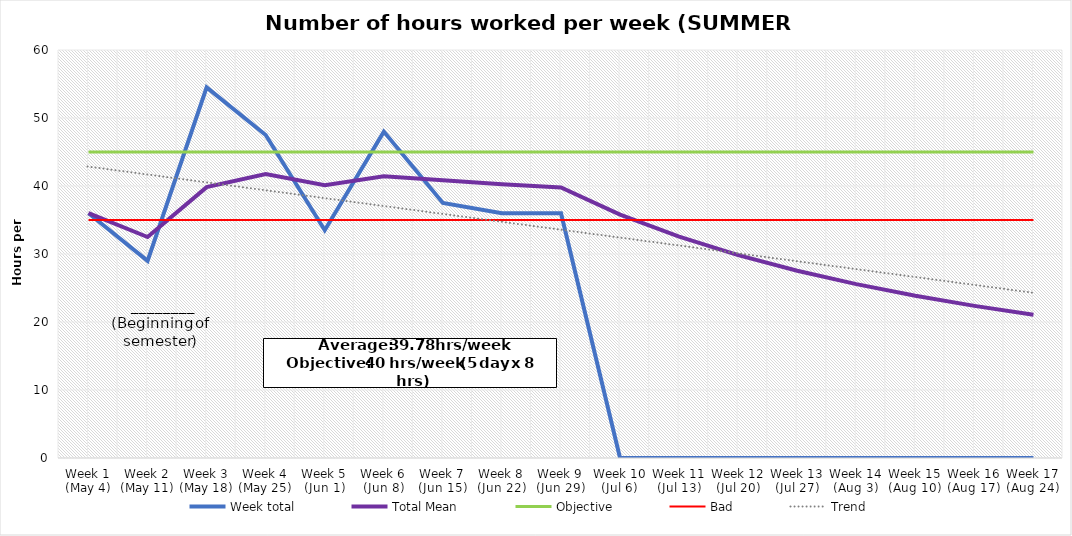
| Category | Week total | Total Mean | Objective | Bad |
|---|---|---|---|---|
| Week 1 (May 4) | 36 | 36 | 45 | 35 |
| Week 2 (May 11) | 29 | 32.5 | 45 | 35 |
| Week 3 (May 18) | 54.5 | 39.833 | 45 | 35 |
| Week 4 (May 25) | 47.5 | 41.75 | 45 | 35 |
| Week 5 (Jun 1) | 33.5 | 40.1 | 45 | 35 |
| Week 6 (Jun 8) | 48 | 41.417 | 45 | 35 |
| Week 7 (Jun 15) | 37.5 | 40.857 | 45 | 35 |
| Week 8 (Jun 22) | 36 | 40.25 | 45 | 35 |
| Week 9 (Jun 29) | 36 | 39.778 | 45 | 35 |
| Week 10 (Jul 6) | 0 | 35.8 | 45 | 35 |
| Week 11 (Jul 13) | 0 | 32.545 | 45 | 35 |
| Week 12 (Jul 20) | 0 | 29.833 | 45 | 35 |
| Week 13 (Jul 27) | 0 | 27.538 | 45 | 35 |
| Week 14 (Aug 3) | 0 | 25.571 | 45 | 35 |
| Week 15 (Aug 10) | 0 | 23.867 | 45 | 35 |
| Week 16 (Aug 17) | 0 | 22.375 | 45 | 35 |
| Week 17 (Aug 24) | 0 | 21.059 | 45 | 35 |